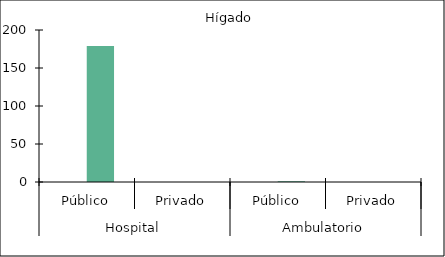
| Category |   |    Hígado |
|---|---|---|
| 0 | 0 | 179 |
| 1 | 0 | 0 |
| 2 | 0 | 1 |
| 3 | 0 | 0 |